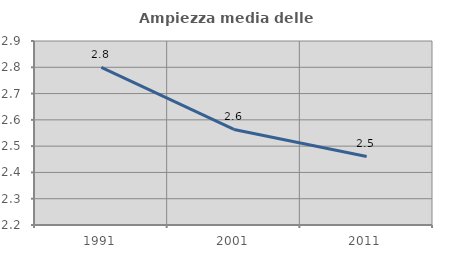
| Category | Ampiezza media delle famiglie |
|---|---|
| 1991.0 | 2.8 |
| 2001.0 | 2.563 |
| 2011.0 | 2.461 |